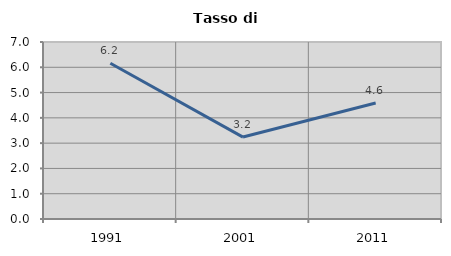
| Category | Tasso di disoccupazione   |
|---|---|
| 1991.0 | 6.158 |
| 2001.0 | 3.24 |
| 2011.0 | 4.59 |